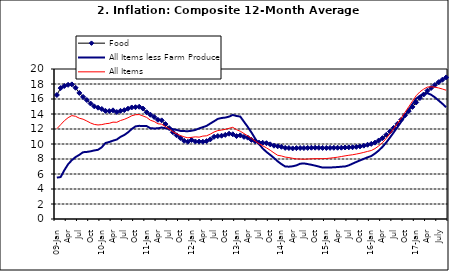
| Category | Food | All Items less Farm Produce | All Items |
|---|---|---|---|
| 09-Jan | 16.536 | 5.519 | 12.032 |
| Feb | 17.454 | 5.591 | 12.567 |
| Mar | 17.742 | 6.51 | 13.101 |
| Apr | 17.89 | 7.302 | 13.51 |
| May | 17.949 | 7.847 | 13.787 |
| June | 17.498 | 8.259 | 13.694 |
| Jul | 16.808 | 8.554 | 13.437 |
| Aug | 16.278 | 8.906 | 13.307 |
| Sep | 15.859 | 8.942 | 13.065 |
| Oct | 15.396 | 9.024 | 12.803 |
| Nov | 15.018 | 9.143 | 12.609 |
| Dec | 14.841 | 9.226 | 12.538 |
| 10-Jan | 14.668 | 9.567 | 12.586 |
| Feb | 14.411 | 10.138 | 12.7 |
| Mar | 14.395 | 10.269 | 12.757 |
| Apr | 14.489 | 10.444 | 12.915 |
| May | 14.266 | 10.597 | 12.893 |
| Jun | 14.424 | 10.948 | 13.132 |
| Jul | 14.514 | 11.193 | 13.284 |
| Aug | 14.706 | 11.549 | 13.5 |
| Sep | 14.872 | 11.997 | 13.764 |
| Oct | 14.906 | 12.345 | 13.908 |
| Nov | 14.967 | 12.423 | 13.928 |
| Dec | 14.723 | 12.383 | 13.74 |
| 11-Jan | 14.233 | 12.385 | 13.542 |
| Feb | 13.903 | 12.099 | 13.161 |
| Mar | 13.606 | 12.077 | 13.001 |
| Apr | 13.227 | 12.088 | 12.694 |
| May | 13.152 | 12.198 | 12.648 |
| Jun | 12.654 | 12.1 | 12.321 |
| Jul | 12.118 | 12.109 | 12.009 |
| Aug | 11.575 | 11.98 | 11.635 |
| Sep | 11.155 | 11.877 | 11.363 |
| Oct | 10.797 | 11.746 | 11.13 |
| Nov | 10.422 | 11.721 | 10.952 |
| Dec | 10.298 | 11.706 | 10.826 |
| 12-Jan | 10.538 | 11.765 | 10.886 |
| 12-Feb | 10.336 | 11.872 | 10.955 |
| 12-Mar | 10.325 | 12.075 | 10.914 |
| Apr | 10.304 | 12.242 | 11.054 |
| May | 10.387 | 12.419 | 11.096 |
| Jun | 10.617 | 12.732 | 11.32 |
| Jul | 10.963 | 13.032 | 11.599 |
| Aug | 11.056 | 13.349 | 11.791 |
| Sep | 11.104 | 13.467 | 11.859 |
| Oct | 11.216 | 13.525 | 11.948 |
| Nov | 11.372 | 13.649 | 12.091 |
| Dec | 11.296 | 13.873 | 12.224 |
| 13-Jan | 11.055 | 13.737 | 11.908 |
| Feb | 11.153 | 13.657 | 11.703 |
| Mar | 10.951 | 12.963 | 11.394 |
| Apr | 10.844 | 12.281 | 11.072 |
| May | 10.548 | 11.531 | 10.761 |
| Jun | 10.352 | 10.704 | 10.383 |
| Jul | 10.186 | 10.005 | 10.047 |
| Aug | 10.168 | 9.4 | 9.761 |
| Sep | 10.105 | 8.939 | 9.486 |
| Oct | 9.955 | 8.553 | 9.167 |
| Nov | 9.774 | 8.136 | 8.815 |
| Dec | 9.695 | 7.691 | 8.496 |
| 14-Jan | 9.626 | 7.317 | 8.408 |
| Feb | 9.484 | 7.005 | 8.257 |
| Mar | 9.464 | 6.976 | 8.19 |
| Apr | 9.416 | 7.03 | 8.092 |
| May | 9.448 | 7.151 | 8.012 |
| Jun | 9.464 | 7.369 | 7.998 |
| Jul | 9.459 | 7.411 | 7.968 |
| Aug | 9.481 | 7.325 | 7.996 |
| Sep | 9.501 | 7.228 | 8.027 |
| Oct | 9.508 | 7.116 | 8.047 |
| Nov | 9.492 | 6.991 | 8.046 |
| Dec | 9.481 | 6.854 | 8.047 |
| 15-Jan | 9.475 | 6.865 | 8.063 |
| Feb | 9.486 | 6.852 | 8.117 |
| Mar | 9.495 | 6.905 | 8.176 |
| Apr | 9.501 | 6.922 | 8.243 |
| May | 9.51 | 6.975 | 8.331 |
| Jun | 9.535 | 7.006 | 8.417 |
| Jul | 9.552 | 7.154 | 8.497 |
| Aug | 9.571 | 7.384 | 8.566 |
| Sep | 9.614 | 7.605 | 8.658 |
| Oct | 9.68 | 7.812 | 8.76 |
| Nov | 9.778 | 8.016 | 8.879 |
| Dec | 9.898 | 8.222 | 9.009 |
| 16-Jan | 10.017 | 8.391 | 9.13 |
| Feb | 10.184 | 8.732 | 9.386 |
| Mar | 10.471 | 9.132 | 9.751 |
| Apr | 10.786 | 9.614 | 10.182 |
| May | 11.221 | 10.196 | 10.746 |
| Jun | 11.672 | 10.864 | 11.372 |
| Jul | 12.162 | 11.553 | 12.045 |
| Aug | 12.696 | 12.247 | 12.744 |
| Sep | 13.238 | 12.98 | 13.454 |
| Oct | 13.817 | 13.757 | 14.206 |
| Nov | 14.386 | 14.542 | 14.958 |
| Dec | 14.946 | 15.307 | 15.697 |
| 17-Jan | 15.536 | 16.042 | 16.441 |
| Feb | 16.127 | 16.436 | 16.958 |
| Mar | 16.598 | 16.682 | 17.315 |
| Apr | 17.106 | 16.772 | 17.591 |
| May | 17.477 | 16.567 | 17.628 |
| June | 17.868 | 16.219 | 17.578 |
| July | 18.247 | 15.798 | 17.475 |
| August | 18.569 | 15.372 | 17.331 |
| September | 18.876 | 14.903 | 17.17 |